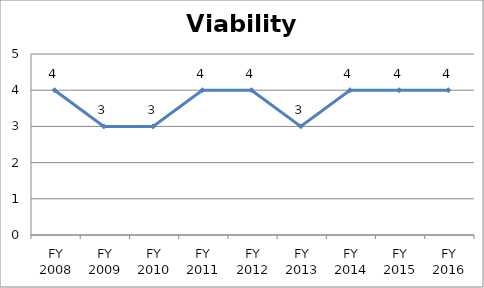
| Category | Viability score |
|---|---|
| FY 2016 | 4 |
| FY 2015 | 4 |
| FY 2014 | 4 |
| FY 2013 | 3 |
| FY 2012 | 4 |
| FY 2011 | 4 |
| FY 2010 | 3 |
| FY 2009 | 3 |
| FY 2008 | 4 |